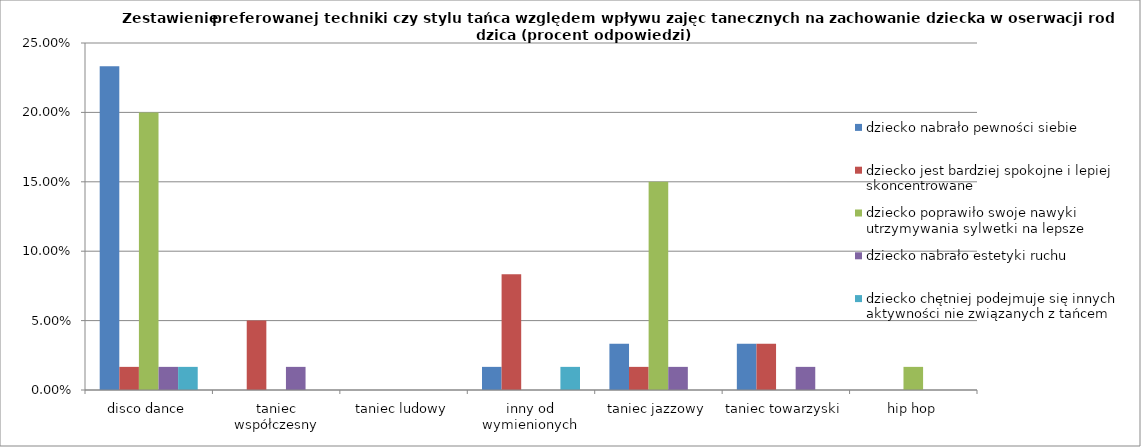
| Category | dziecko nabrało pewności siebie | dziecko jest bardziej spokojne i lepiej skoncentrowane | dziecko poprawiło swoje nawyki utrzymywania sylwetki na lepsze | dziecko nabrało estetyki ruchu | dziecko chętniej podejmuje się innych aktywności nie związanych z tańcem |
|---|---|---|---|---|---|
| disco dance | 0.233 | 0.017 | 0.2 | 0.017 | 0.017 |
| taniec współczesny | 0 | 0.05 | 0 | 0.017 | 0 |
| taniec ludowy | 0 | 0 | 0 | 0 | 0 |
| inny od wymienionych | 0.017 | 0.083 | 0 | 0 | 0.017 |
| taniec jazzowy | 0.033 | 0.017 | 0.15 | 0.017 | 0 |
| taniec towarzyski | 0.033 | 0.033 | 0 | 0.017 | 0 |
| hip hop | 0 | 0 | 0.017 | 0 | 0 |